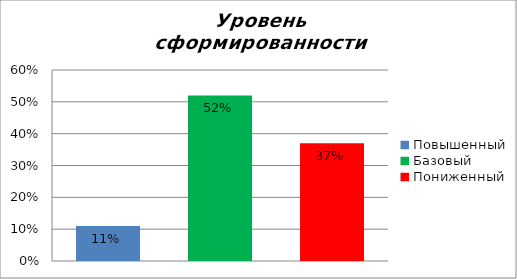
| Category | Уровень сформированности предметных результатов |
|---|---|
| Повышенный | 0.11 |
| Базовый | 0.52 |
| Пониженный | 0.37 |